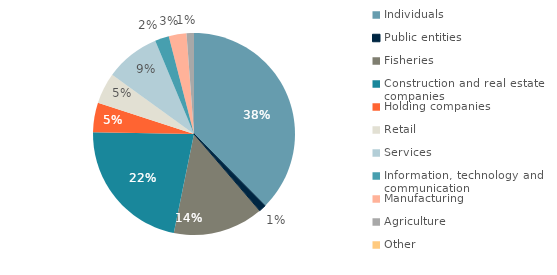
| Category | Series 0 |
|---|---|
| Individuals | 320690 |
| Public entities | 9783 |
| Fisheries | 123626 |
| Construction and real estate companies  | 188327 |
| Holding companies | 40490 |
| Retail | 42235 |
| Services | 74743 |
| Information, technology and communication | 19220 |
| Manufacturing | 24167 |
| Agriculture | 10135 |
| Other | 1 |